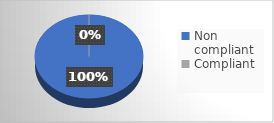
| Category | Series 0 |
|---|---|
| Non compliant | 6 |
| Compliant | 0 |